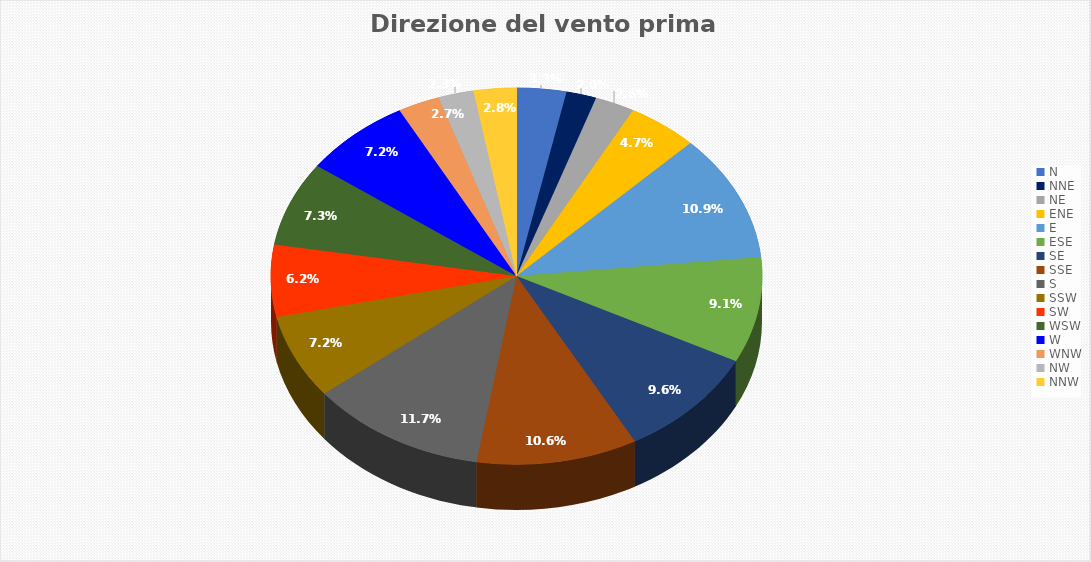
| Category | Percentuale |
|---|---|
| N | 3.266 |
| NNE | 1.981 |
| NE | 2.606 |
| ENE | 4.656 |
| E | 10.876 |
| ESE | 9.069 |
| SE | 9.555 |
| SSE | 10.598 |
| S | 11.675 |
| SSW | 7.227 |
| SW | 6.185 |
| WSW | 7.262 |
| W | 7.158 |
| WNW | 2.745 |
| NW | 2.328 |
| NNW | 2.814 |